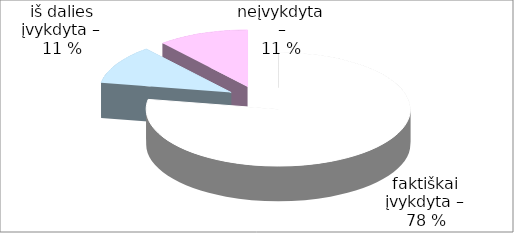
| Category | Series 0 |
|---|---|
| 0 | 14 |
| 1 | 2 |
| 2 | 2 |